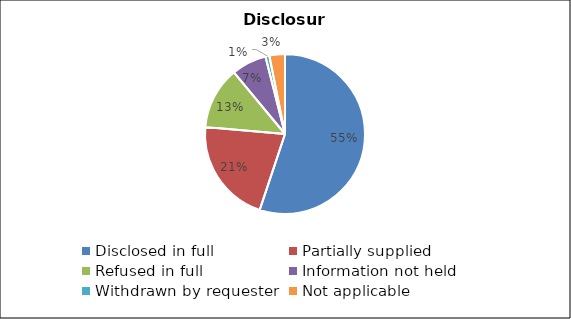
| Category | Series 0 |
|---|---|
| Disclosed in full | 140 |
| Partially supplied | 54 |
| Refused in full | 32 |
| Information not held | 18 |
| Withdrawn by requester | 2 |
| Not applicable | 8 |